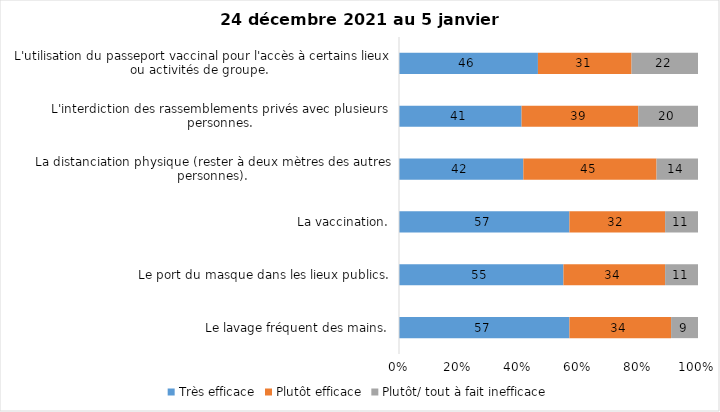
| Category | Très efficace | Plutôt efficace | Plutôt/ tout à fait inefficace |
|---|---|---|---|
| Le lavage fréquent des mains. | 57 | 34 | 9 |
| Le port du masque dans les lieux publics. | 55 | 34 | 11 |
| La vaccination. | 57 | 32 | 11 |
| La distanciation physique (rester à deux mètres des autres personnes). | 42 | 45 | 14 |
| L'interdiction des rassemblements privés avec plusieurs personnes. | 41 | 39 | 20 |
| L'utilisation du passeport vaccinal pour l'accès à certains lieux ou activités de groupe.  | 46 | 31 | 22 |